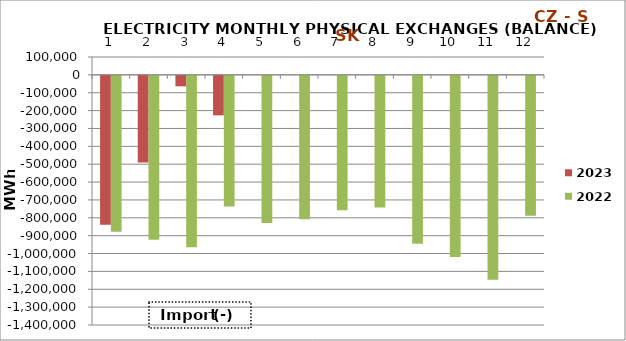
| Category | 2023 | 2022 |
|---|---|---|
| 0 | -833306.575 | -871895.95 |
| 1 | -485281.425 | -916818.85 |
| 2 | -58456.875 | -958606.05 |
| 3 | -220977.575 | -731552.6 |
| 4 | 0 | -823678.25 |
| 5 | 0 | -801866.15 |
| 6 | 0 | -751923.41 |
| 7 | 0 | -736515.35 |
| 8 | 0 | -939380.875 |
| 9 | 0 | -1013315.95 |
| 10 | 0 | -1141454.1 |
| 11 | 0 | -782718.05 |